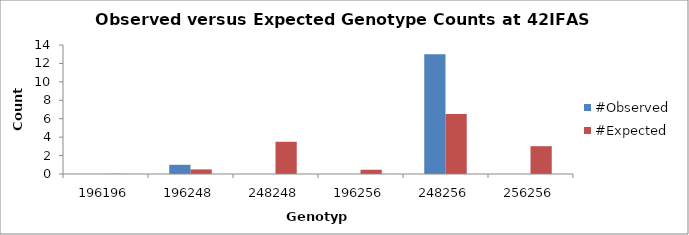
| Category | #Observed | #Expected |
|---|---|---|
| 196196.0 | 0 | 0.018 |
| 196248.0 | 1 | 0.5 |
| 248248.0 | 0 | 3.5 |
| 196256.0 | 0 | 0.464 |
| 248256.0 | 13 | 6.5 |
| 256256.0 | 0 | 3.018 |